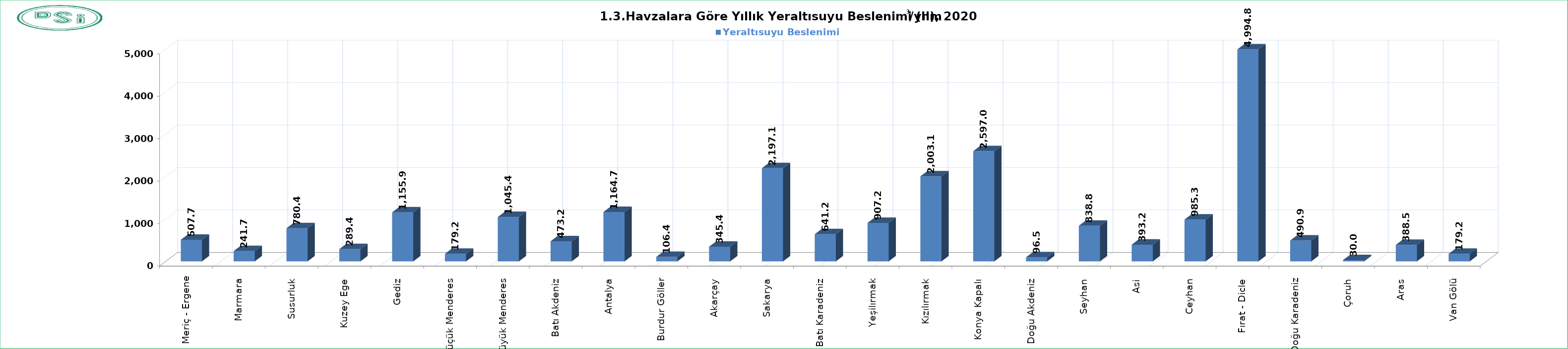
| Category | Yeraltısuyu Beslenimi  |
|---|---|
| Meriç - Ergene | 507.7 |
| Marmara  | 241.7 |
| Susurluk  | 780.4 |
| Kuzey Ege  | 289.4 |
| Gediz  | 1155.9 |
| Küçük Menderes  | 179.2 |
| Büyük Menderes  | 1045.4 |
| Batı Akdeniz  | 473.2 |
| Antalya  | 1164.68 |
| Burdur Göller  | 106.4 |
| Akarçay  | 345.4 |
| Sakarya  | 2197.1 |
| Batı Karadeniz  | 641.23 |
| Yeşilırmak  | 907.2 |
| Kızılırmak  | 2003.1 |
| Konya Kapalı  | 2597 |
| Doğu Akdeniz  | 96.5 |
| Seyhan  | 838.8 |
| Asi  | 393.2 |
| Ceyhan  | 985.3 |
| Fırat - Dicle  | 4994.8 |
| Doğu Karadeniz  | 490.9 |
| Çoruh  | 30 |
| Aras  | 388.54 |
| Van Gölü  | 179.2 |